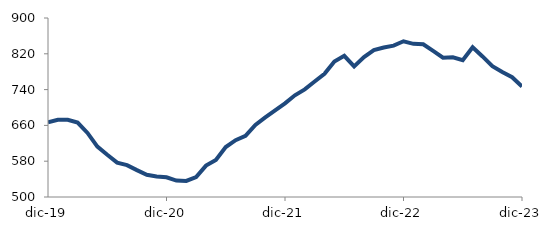
| Category | Series 0 |
|---|---|
| 2019-12-01 | 667.143 |
| 2020-01-01 | 672.455 |
| 2020-02-01 | 672.659 |
| 2020-03-01 | 666.213 |
| 2020-04-01 | 643.145 |
| 2020-05-01 | 612.572 |
| 2020-06-01 | 594.292 |
| 2020-07-01 | 576.858 |
| 2020-08-01 | 571.224 |
| 2020-09-01 | 560.032 |
| 2020-10-01 | 549.541 |
| 2020-11-01 | 545.982 |
| 2020-12-01 | 544.038 |
| 2021-01-01 | 536.772 |
| 2021-02-01 | 535.938 |
| 2021-03-01 | 544.717 |
| 2021-04-01 | 570.16 |
| 2021-05-01 | 582.981 |
| 2021-06-01 | 611.684 |
| 2021-07-01 | 627.037 |
| 2021-08-01 | 636.642 |
| 2021-09-01 | 661.114 |
| 2021-10-01 | 677.889 |
| 2021-11-01 | 693.389 |
| 2021-12-01 | 709.343 |
| 2022-01-01 | 727.31 |
| 2022-02-01 | 740.539 |
| 2022-03-01 | 758.027 |
| 2022-04-01 | 775.241 |
| 2022-05-01 | 802.956 |
| 2022-06-01 | 815.434 |
| 2022-07-01 | 791.89 |
| 2022-08-01 | 812.76 |
| 2022-09-01 | 828.12 |
| 2022-10-01 | 834 |
| 2022-11-01 | 838.178 |
| 2022-12-01 | 847.954 |
| 2023-01-01 | 842.285 |
| 2023-02-01 | 841.25 |
| 2023-03-01 | 826.38 |
| 2023-04-01 | 811.394 |
| 2023-05-01 | 812.228 |
| 2023-06-01 | 805.926 |
| 2023-07-01 | 834.815 |
| 2023-08-01 | 814.103 |
| 2023-09-01 | 792.442 |
| 2023-10-01 | 779.206 |
| 2023-11-01 | 767.605 |
| 2023-12-01 | 746.855 |